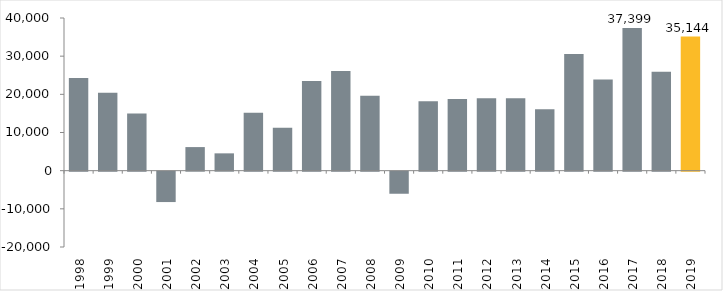
| Category | nuevos empleos |
|---|---|
| 1998.0 | 24308 |
| 1999.0 | 20418 |
| 2000.0 | 14948 |
| 2001.0 | -7962 |
| 2002.0 | 6179 |
| 2003.0 | 4537 |
| 2004.0 | 15182 |
| 2005.0 | 11264 |
| 2006.0 | 23463 |
| 2007.0 | 26105 |
| 2008.0 | 19629 |
| 2009.0 | -5785 |
| 2010.0 | 18159 |
| 2011.0 | 18764 |
| 2012.0 | 18984 |
| 2013.0 | 18962 |
| 2014.0 | 16095 |
| 2015.0 | 30545 |
| 2016.0 | 23894 |
| 2017.0 | 37399 |
| 2018.0 | 25936 |
| 2019.0 | 35144 |